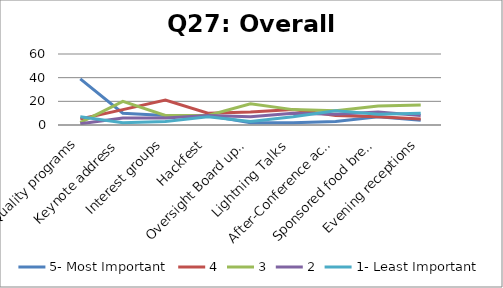
| Category | 5- Most Important | 4 | 3 | 2 | 1- Least Important |
|---|---|---|---|---|---|
| Quality programs | 39 | 5 | 2 | 1 | 7 |
| Keynote address | 10 | 13 | 20 | 6 | 2 |
| Interest groups | 8 | 21 | 8 | 6 | 3 |
| Hackfest | 8 | 10 | 8 | 8 | 7 |
| Oversight Board updates | 2 | 11 | 18 | 7 | 3 |
| Lightning Talks | 2 | 13 | 13 | 10 | 7 |
| After-Conference activities | 3 | 8 | 12 | 9 | 12 |
| Sponsored food breaks | 7 | 7 | 16 | 11 | 9 |
| Evening receptions | 4 | 5 | 17 | 8 | 10 |